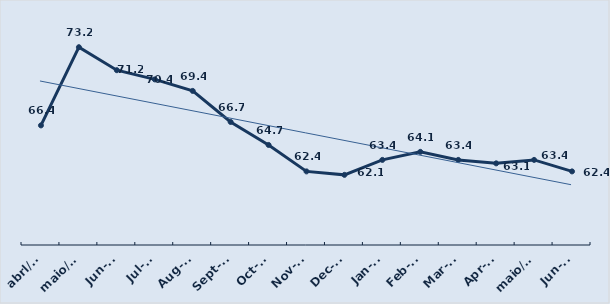
| Category | Series 0 |
|---|---|
| abrl/17 | 66.4 |
| maio/17 | 73.2 |
| Jun-18 | 71.2 |
| Jul-17 | 70.4 |
| Aug-17 | 69.4 |
| Sep-17 | 66.7 |
| Oct-17 | 64.7 |
| Nov-17 | 62.4 |
| Dec-17 | 62.1 |
| Jan-18 | 63.4 |
| Feb-18 | 64.1 |
| Mar-18 | 63.4 |
| Apr-18 | 63.1 |
| maio/18 | 63.4 |
| Jun-18 | 62.4 |